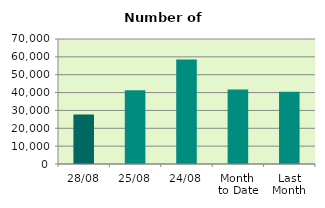
| Category | Series 0 |
|---|---|
| 28/08 | 27736 |
| 25/08 | 41362 |
| 24/08 | 58564 |
| Month 
to Date | 41727 |
| Last
Month | 40410.857 |